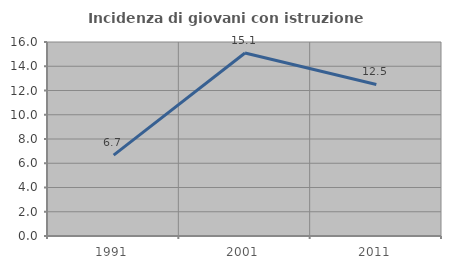
| Category | Incidenza di giovani con istruzione universitaria |
|---|---|
| 1991.0 | 6.667 |
| 2001.0 | 15.094 |
| 2011.0 | 12.5 |